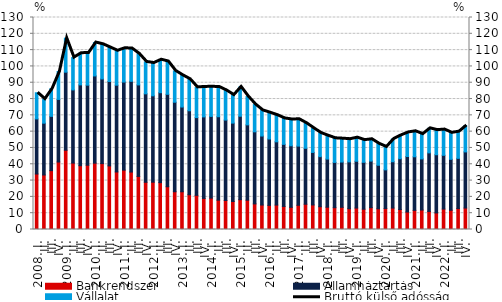
| Category | Bankrendszer | Államháztartás | Vállalat |
|---|---|---|---|
| 2008. I. | 34.032 | 33.783 | 16.043 |
|          II. | 33.437 | 31.753 | 14.771 |
|          III. | 36.099 | 33.286 | 16.939 |
|          IV. | 41.387 | 38.378 | 17.105 |
| 2009. I. | 48.611 | 47.856 | 20.859 |
|          II. | 40.735 | 44.851 | 19.849 |
|          III. | 39.122 | 49.566 | 19.445 |
|          IV. | 39.41 | 49.102 | 19.688 |
| 2010. I. | 40.67 | 53.492 | 20.483 |
|          II. | 40.409 | 51.915 | 21.253 |
|          III. | 39.005 | 51.761 | 20.832 |
|          IV. | 35.292 | 53.201 | 21.107 |
| 2011. I. | 36.402 | 54.014 | 20.738 |
|          II. | 35.241 | 55.621 | 20.097 |
|          III. | 32.546 | 56.115 | 19.012 |
|          IV. | 28.948 | 54.248 | 19.553 |
| 2012. I. | 29.024 | 52.965 | 20.088 |
|          II. | 28.735 | 55.159 | 20.222 |
|          III. | 26.223 | 56.681 | 20.094 |
|          IV. | 23.147 | 54.9 | 19.178 |
| 2013. I. | 23.146 | 51.949 | 19.4 |
| II. | 21.314 | 51.5 | 19.27 |
|          III. | 20.934 | 47.687 | 18.527 |
| IV. | 19.047 | 50.006 | 18.373 |
| 2014. I. | 19.246 | 50.088 | 18.18 |
| II. | 17.983 | 51.168 | 18.216 |
|          III. | 17.805 | 49.316 | 18.119 |
| IV. | 17.185 | 48.056 | 17.197 |
| 2015. I. | 18.29 | 51.141 | 18 |
| II. | 17.971 | 46.19 | 17.365 |
|          III. | 15.705 | 44.189 | 16.73 |
| IV. | 15.013 | 42.304 | 15.681 |
| 2016. I. | 14.803 | 40.685 | 16.124 |
| II. | 14.991 | 38.772 | 16.322 |
|          III. | 14.133 | 38.084 | 15.906 |
| IV. | 13.6 | 37.749 | 16.116 |
| 2017. I. | 14.853 | 36.287 | 16.442 |
| II. | 15.495 | 34.304 | 15.381 |
|          III. | 15.057 | 32.214 | 14.849 |
| IV. | 13.966 | 30.707 | 14.49 |
| 2018. I. | 13.674 | 29.515 | 14.272 |
| II. | 13.389 | 27.757 | 14.769 |
|          III. | 13.597 | 27.769 | 14.334 |
| IV. | 12.758 | 28.717 | 13.91 |
| 2019. I. | 13.163 | 28.685 | 14.479 |
| II. | 12.448 | 28.754 | 13.602 |
|          III. | 13.39 | 28.565 | 13.378 |
| IV. | 12.71 | 26.685 | 13.156 |
| 2020. I. | 12.887 | 23.698 | 14.026 |
| II. | 13.152 | 28.389 | 13.98 |
|          III. | 12.243 | 31.167 | 14.303 |
| IV. | 10.727 | 34.043 | 14.769 |
| 2021. I. | 11.723 | 32.87 | 15.635 |
| II. | 11.928 | 31.372 | 15.193 |
|          III. | 11.08 | 35.905 | 15.054 |
| IV. | 10.158 | 35.697 | 15.081 |
| 2022. I. | 12.546 | 32.952 | 15.781 |
| II. | 11.803 | 31.242 | 16.216 |
|          III. | 12.861 | 30.768 | 16.405 |
| IV. | 13.165 | 34.413 | 16.207 |